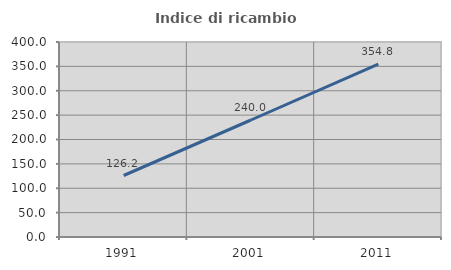
| Category | Indice di ricambio occupazionale  |
|---|---|
| 1991.0 | 126.154 |
| 2001.0 | 240 |
| 2011.0 | 354.839 |